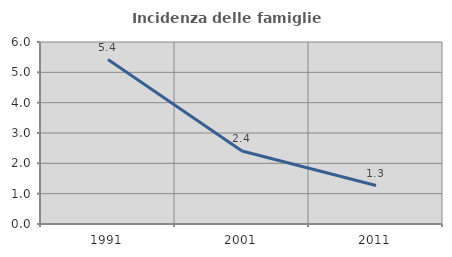
| Category | Incidenza delle famiglie numerose |
|---|---|
| 1991.0 | 5.42 |
| 2001.0 | 2.407 |
| 2011.0 | 1.268 |